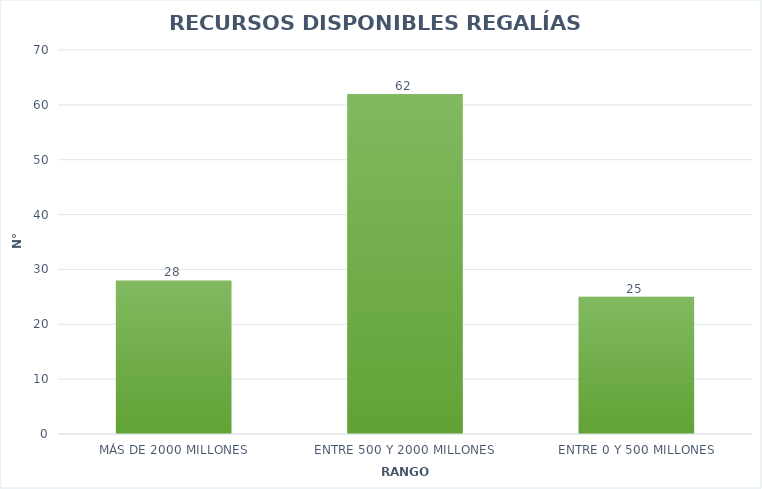
| Category | Series 0 |
|---|---|
| MÁS DE 2000 MILLONES | 28 |
| ENTRE 500 Y 2000 MILLONES | 62 |
| ENTRE 0 Y 500 MILLONES | 25 |